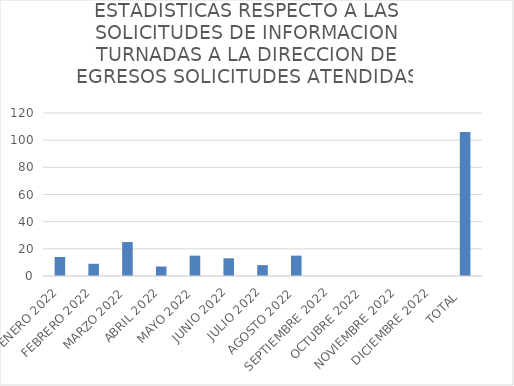
| Category | ESTADISTICAS RESPECTO A LAS SOLICITUDES DE INFORMACION TURNADAS A LA DIRECCION DE EGRESOS |
|---|---|
| ENERO 2022 | 14 |
| FEBRERO 2022 | 9 |
| MARZO 2022 | 25 |
| ABRIL 2022 | 7 |
| MAYO 2022 | 15 |
| JUNIO 2022 | 13 |
| JULIO 2022 | 8 |
| AGOSTO 2022 | 15 |
| SEPTIEMBRE 2022 | 0 |
| OCTUBRE 2022 | 0 |
| NOVIEMBRE 2022 | 0 |
| DICIEMBRE 2022 | 0 |
| TOTAL  | 106 |